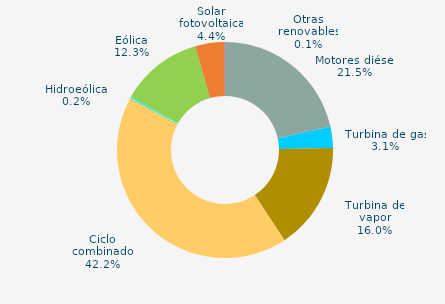
| Category | Series 0 |
|---|---|
| Motores diésel | 21.546 |
| Turbina de gas | 3.145 |
| Turbina de vapor | 16.023 |
| Ciclo combinado | 42.244 |
| Cogeneración | 0 |
| Hidráulica | 0.038 |
| Hidroeólica | 0.219 |
| Eólica | 12.327 |
| Solar fotovoltaica | 4.378 |
| Otras renovables | 0.08 |